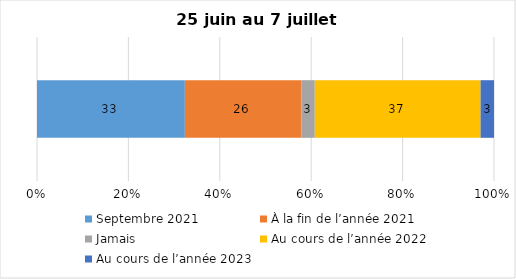
| Category | Septembre 2021 | À la fin de l’année 2021 | Jamais | Au cours de l’année 2022 | Au cours de l’année 2023 |
|---|---|---|---|---|---|
| 0 | 33 | 26 | 3 | 37 | 3 |